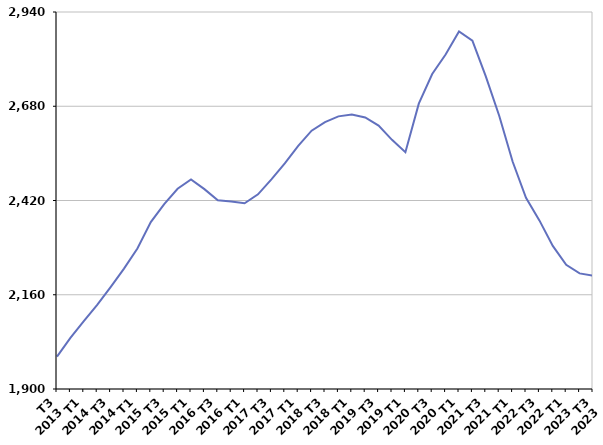
| Category | Inscrits depuis plus d'un an |
|---|---|
| T3
2013 | 1989.5 |
| T4
2013 | 2040.8 |
| T1
2014 | 2087.3 |
| T2
2014 | 2131.8 |
| T3
2014 | 2181 |
| T4
2014 | 2232.2 |
| T1
2015 | 2287.6 |
| T2
2015 | 2360.4 |
| T3
2015 | 2410 |
| T4
2015 | 2452.5 |
| T1
2016 | 2478.1 |
| T2
2016 | 2451.3 |
| T3
2016 | 2420.8 |
| T4
2016 | 2417.2 |
| T1
2017 | 2412.3 |
| T2
2017 | 2437 |
| T3
2017 | 2478.5 |
| T4
2017 | 2522.4 |
| T1
2018 | 2570.7 |
| T2
2018 | 2612.6 |
| T3
2018 | 2636.4 |
| T4
2018 | 2652.1 |
| T1
2019 | 2657.2 |
| T2
2019 | 2649.1 |
| T3
2019 | 2626.5 |
| T4
2019 | 2587.3 |
| T1
2020 | 2553.3 |
| T2
2020 | 2687.2 |
| T3
2020 | 2768.9 |
| T4
2020 | 2822.8 |
| T1
2021 | 2886.3 |
| T2
2021 | 2861.2 |
| T3
2021 | 2762.6 |
| T4
2021 | 2653.8 |
| T1
2022 | 2527.6 |
| T2
2022 | 2427.5 |
| T3
2022 | 2365.1 |
| T4
2022 | 2294.8 |
| T1
2023 | 2242.4 |
| T2
2023 | 2219 |
| T3
2023 | 2212.8 |